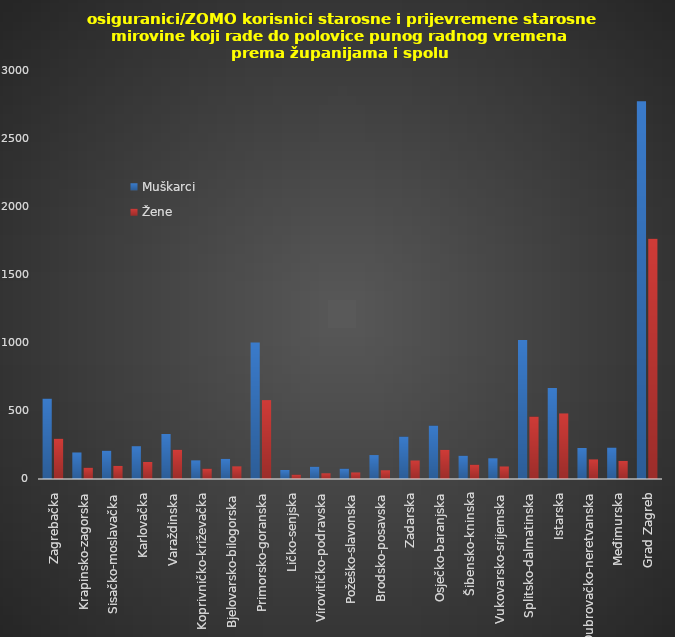
| Category | Muškarci | Žene |
|---|---|---|
| Zagrebačka | 591 | 296 |
| Krapinsko-zagorska | 195 | 83 |
| Sisačko-moslavačka | 208 | 96 |
| Karlovačka | 241 | 125 |
| Varaždinska | 331 | 215 |
| Koprivničko-križevačka | 137 | 76 |
| Bjelovarsko-bilogorska | 148 | 93 |
| Primorsko-goranska | 1004 | 580 |
| Ličko-senjska | 66 | 32 |
| Virovitičko-podravska | 90 | 42 |
| Požeško-slavonska | 76 | 48 |
| Brodsko-posavska | 176 | 64 |
| Zadarska | 312 | 136 |
| Osječko-baranjska | 393 | 214 |
| Šibensko-kninska | 171 | 105 |
| Vukovarsko-srijemska | 152 | 92 |
| Splitsko-dalmatinska | 1022 | 459 |
| Istarska | 669 | 482 |
| Dubrovačko-neretvanska | 228 | 144 |
| Međimurska | 231 | 133 |
| Grad Zagreb | 2777 | 1767 |